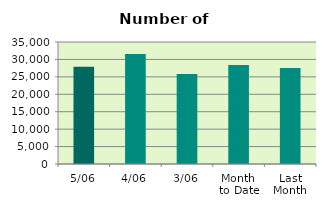
| Category | Series 0 |
|---|---|
| 5/06 | 27902 |
| 4/06 | 31538 |
| 3/06 | 25832 |
| Month 
to Date | 28424 |
| Last
Month | 27522.455 |